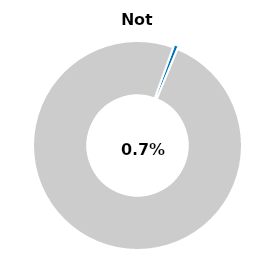
| Category | Series 0 |
|---|---|
| Not passed | 0.007 |
| Other | 0.993 |